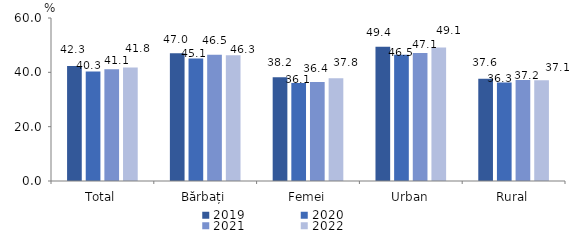
| Category | 2019 | 2020 | 2021 | 2022 |
|---|---|---|---|---|
| Total | 42.3 | 40.3 | 41.1 | 41.8 |
| Bărbați | 47 | 45.1 | 46.5 | 46.3 |
| Femei | 38.2 | 36.1 | 36.4 | 37.8 |
| Urban | 49.4 | 46.5 | 47.1 | 49.1 |
| Rural | 37.6 | 36.3 | 37.2 | 37.1 |